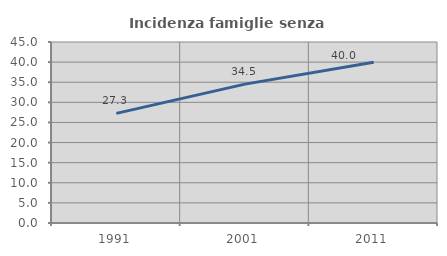
| Category | Incidenza famiglie senza nuclei |
|---|---|
| 1991.0 | 27.263 |
| 2001.0 | 34.531 |
| 2011.0 | 39.963 |